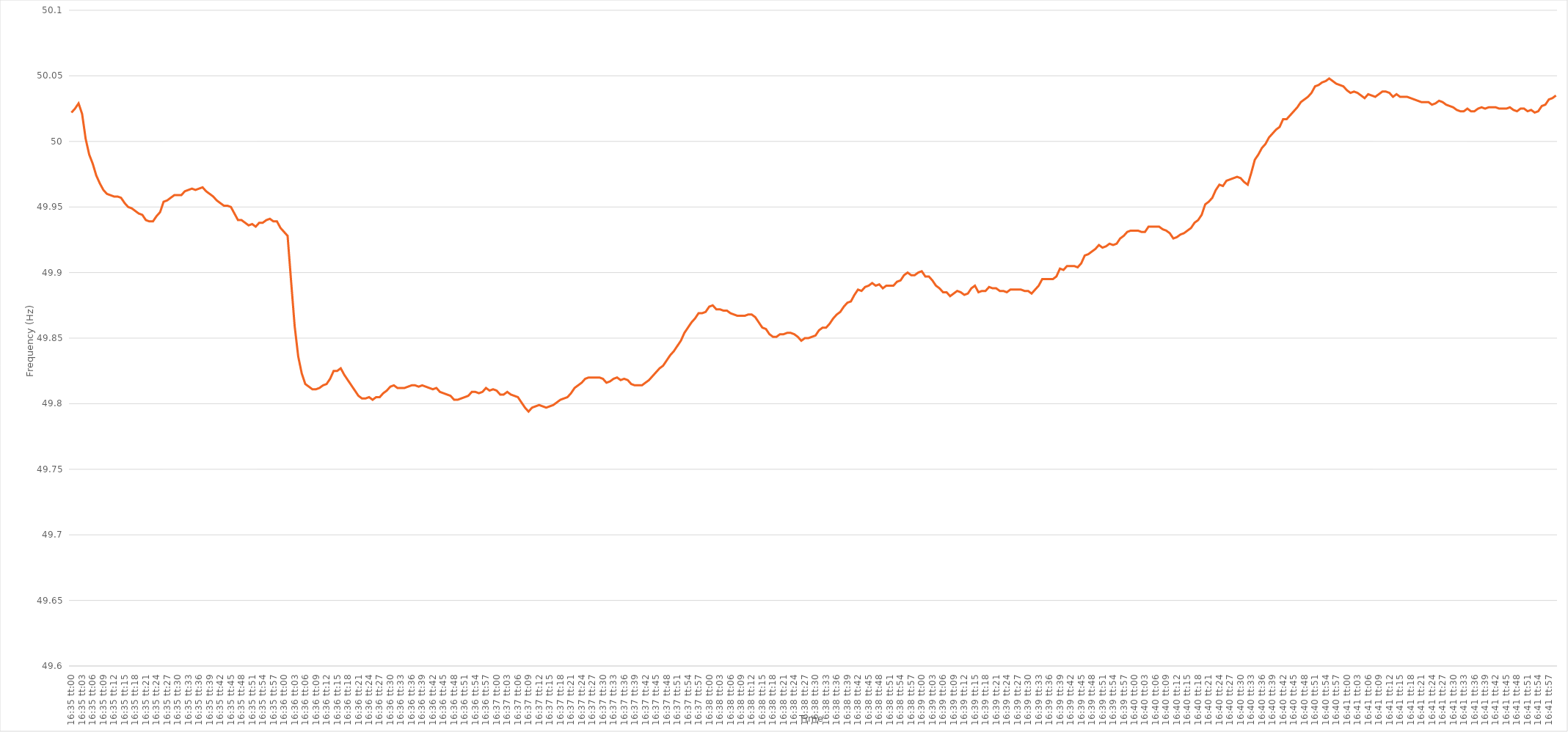
| Category | Series 0 |
|---|---|
| 0.6909722222222222 | 50.022 |
| 0.6909837962962962 | 50.025 |
| 0.6909953703703704 | 50.029 |
| 0.6910069444444445 | 50.021 |
| 0.6910185185185185 | 50.002 |
| 0.6910300925925926 | 49.99 |
| 0.6910416666666667 | 49.983 |
| 0.6910532407407407 | 49.974 |
| 0.6910648148148147 | 49.968 |
| 0.6910763888888889 | 49.963 |
| 0.691087962962963 | 49.96 |
| 0.691099537037037 | 49.959 |
| 0.6911111111111111 | 49.958 |
| 0.6911226851851852 | 49.958 |
| 0.6911342592592593 | 49.957 |
| 0.6911458333333332 | 49.953 |
| 0.6911574074074074 | 49.95 |
| 0.6911689814814815 | 49.949 |
| 0.6911805555555556 | 49.947 |
| 0.6911921296296296 | 49.945 |
| 0.6912037037037037 | 49.944 |
| 0.6912152777777778 | 49.94 |
| 0.691226851851852 | 49.939 |
| 0.6912384259259259 | 49.939 |
| 0.69125 | 49.943 |
| 0.6912615740740741 | 49.946 |
| 0.6912731481481481 | 49.954 |
| 0.6912847222222221 | 49.955 |
| 0.6912962962962963 | 49.957 |
| 0.6913078703703704 | 49.959 |
| 0.6913194444444444 | 49.959 |
| 0.6913310185185185 | 49.959 |
| 0.6913425925925926 | 49.962 |
| 0.6913541666666667 | 49.963 |
| 0.6913657407407406 | 49.964 |
| 0.6913773148148148 | 49.963 |
| 0.6913888888888889 | 49.964 |
| 0.691400462962963 | 49.965 |
| 0.691412037037037 | 49.962 |
| 0.6914236111111111 | 49.96 |
| 0.6914351851851852 | 49.958 |
| 0.6914467592592594 | 49.955 |
| 0.6914583333333333 | 49.953 |
| 0.6914699074074074 | 49.951 |
| 0.6914814814814815 | 49.951 |
| 0.6914930555555556 | 49.95 |
| 0.6915046296296296 | 49.945 |
| 0.6915162037037037 | 49.94 |
| 0.6915277777777779 | 49.94 |
| 0.6915393518518519 | 49.938 |
| 0.6915509259259259 | 49.936 |
| 0.6915625 | 49.937 |
| 0.6915740740740741 | 49.935 |
| 0.691585648148148 | 49.938 |
| 0.6915972222222222 | 49.938 |
| 0.6916087962962963 | 49.94 |
| 0.6916203703703704 | 49.941 |
| 0.6916319444444444 | 49.939 |
| 0.6916435185185185 | 49.939 |
| 0.6916550925925926 | 49.934 |
| 0.6916666666666668 | 49.931 |
| 0.6916782407407407 | 49.928 |
| 0.6916898148148148 | 49.893 |
| 0.6917013888888889 | 49.859 |
| 0.691712962962963 | 49.836 |
| 0.691724537037037 | 49.823 |
| 0.6917361111111111 | 49.815 |
| 0.6917476851851853 | 49.813 |
| 0.6917592592592593 | 49.811 |
| 0.6917708333333333 | 49.811 |
| 0.6917824074074074 | 49.812 |
| 0.6917939814814815 | 49.814 |
| 0.6918055555555555 | 49.815 |
| 0.6918171296296296 | 49.819 |
| 0.6918287037037038 | 49.825 |
| 0.6918402777777778 | 49.825 |
| 0.6918518518518518 | 49.827 |
| 0.6918634259259259 | 49.822 |
| 0.691875 | 49.818 |
| 0.6918865740740742 | 49.814 |
| 0.6918981481481481 | 49.81 |
| 0.6919097222222222 | 49.806 |
| 0.6919212962962963 | 49.804 |
| 0.6919328703703704 | 49.804 |
| 0.6919444444444444 | 49.805 |
| 0.6919560185185185 | 49.803 |
| 0.6919675925925927 | 49.805 |
| 0.6919791666666667 | 49.805 |
| 0.6919907407407407 | 49.808 |
| 0.6920023148148148 | 49.81 |
| 0.6920138888888889 | 49.813 |
| 0.6920254629629629 | 49.814 |
| 0.692037037037037 | 49.812 |
| 0.6920486111111112 | 49.812 |
| 0.6920601851851852 | 49.812 |
| 0.6920717592592592 | 49.813 |
| 0.6920833333333333 | 49.814 |
| 0.6920949074074074 | 49.814 |
| 0.6921064814814816 | 49.813 |
| 0.6921180555555555 | 49.814 |
| 0.6921296296296297 | 49.813 |
| 0.6921412037037037 | 49.812 |
| 0.6921527777777778 | 49.811 |
| 0.6921643518518518 | 49.812 |
| 0.6921759259259259 | 49.809 |
| 0.6921875000000001 | 49.808 |
| 0.6921990740740741 | 49.807 |
| 0.6922106481481481 | 49.806 |
| 0.6922222222222222 | 49.803 |
| 0.6922337962962963 | 49.803 |
| 0.6922453703703703 | 49.804 |
| 0.6922569444444444 | 49.805 |
| 0.6922685185185186 | 49.806 |
| 0.6922800925925926 | 49.809 |
| 0.6922916666666666 | 49.809 |
| 0.6923032407407407 | 49.808 |
| 0.6923148148148148 | 49.809 |
| 0.692326388888889 | 49.812 |
| 0.6923379629629629 | 49.81 |
| 0.692349537037037 | 49.811 |
| 0.6923611111111111 | 49.81 |
| 0.6923726851851852 | 49.807 |
| 0.6923842592592592 | 49.807 |
| 0.6923958333333333 | 49.809 |
| 0.6924074074074075 | 49.807 |
| 0.6924189814814815 | 49.806 |
| 0.6924305555555555 | 49.805 |
| 0.6924421296296296 | 49.801 |
| 0.6924537037037037 | 49.797 |
| 0.6924652777777777 | 49.794 |
| 0.6924768518518518 | 49.797 |
| 0.692488425925926 | 49.798 |
| 0.6925 | 49.799 |
| 0.692511574074074 | 49.798 |
| 0.6925231481481481 | 49.797 |
| 0.6925347222222222 | 49.798 |
| 0.6925462962962964 | 49.799 |
| 0.6925578703703703 | 49.801 |
| 0.6925694444444445 | 49.803 |
| 0.6925810185185185 | 49.804 |
| 0.6925925925925926 | 49.805 |
| 0.6926041666666666 | 49.808 |
| 0.6926157407407407 | 49.812 |
| 0.6926273148148149 | 49.814 |
| 0.6926388888888889 | 49.816 |
| 0.692650462962963 | 49.819 |
| 0.692662037037037 | 49.82 |
| 0.6926736111111111 | 49.82 |
| 0.6926851851851853 | 49.82 |
| 0.6926967592592592 | 49.82 |
| 0.6927083333333334 | 49.819 |
| 0.6927199074074074 | 49.816 |
| 0.6927314814814814 | 49.817 |
| 0.6927430555555555 | 49.819 |
| 0.6927546296296296 | 49.82 |
| 0.6927662037037038 | 49.818 |
| 0.6927777777777777 | 49.819 |
| 0.6927893518518519 | 49.818 |
| 0.6928009259259259 | 49.815 |
| 0.6928125 | 49.814 |
| 0.692824074074074 | 49.814 |
| 0.6928356481481481 | 49.814 |
| 0.6928472222222223 | 49.816 |
| 0.6928587962962963 | 49.818 |
| 0.6928703703703704 | 49.821 |
| 0.6928819444444444 | 49.824 |
| 0.6928935185185185 | 49.827 |
| 0.6929050925925927 | 49.829 |
| 0.6929166666666666 | 49.833 |
| 0.6929282407407408 | 49.837 |
| 0.6929398148148148 | 49.84 |
| 0.692951388888889 | 49.844 |
| 0.6929629629629629 | 49.848 |
| 0.692974537037037 | 49.854 |
| 0.6929861111111112 | 49.858 |
| 0.6929976851851851 | 49.862 |
| 0.6930092592592593 | 49.865 |
| 0.6930208333333333 | 49.869 |
| 0.6930324074074075 | 49.869 |
| 0.6930439814814814 | 49.87 |
| 0.6930555555555555 | 49.874 |
| 0.6930671296296297 | 49.875 |
| 0.6930787037037037 | 49.872 |
| 0.6930902777777778 | 49.872 |
| 0.6931018518518518 | 49.871 |
| 0.693113425925926 | 49.871 |
| 0.6931250000000001 | 49.869 |
| 0.693136574074074 | 49.868 |
| 0.6931481481481482 | 49.867 |
| 0.6931597222222222 | 49.867 |
| 0.6931712962962964 | 49.867 |
| 0.6931828703703703 | 49.868 |
| 0.6931944444444444 | 49.868 |
| 0.6932060185185186 | 49.866 |
| 0.6932175925925925 | 49.862 |
| 0.6932291666666667 | 49.858 |
| 0.6932407407407407 | 49.857 |
| 0.6932523148148149 | 49.853 |
| 0.6932638888888888 | 49.851 |
| 0.6932754629629629 | 49.851 |
| 0.6932870370370371 | 49.853 |
| 0.6932986111111111 | 49.853 |
| 0.6933101851851852 | 49.854 |
| 0.6933217592592592 | 49.854 |
| 0.6933333333333334 | 49.853 |
| 0.6933449074074075 | 49.851 |
| 0.6933564814814814 | 49.848 |
| 0.6933680555555556 | 49.85 |
| 0.6933796296296296 | 49.85 |
| 0.6933912037037038 | 49.851 |
| 0.6934027777777777 | 49.852 |
| 0.6934143518518519 | 49.856 |
| 0.693425925925926 | 49.858 |
| 0.6934374999999999 | 49.858 |
| 0.6934490740740741 | 49.861 |
| 0.6934606481481481 | 49.865 |
| 0.6934722222222223 | 49.868 |
| 0.6934837962962962 | 49.87 |
| 0.6934953703703703 | 49.874 |
| 0.6935069444444445 | 49.877 |
| 0.6935185185185185 | 49.878 |
| 0.6935300925925926 | 49.883 |
| 0.6935416666666666 | 49.887 |
| 0.6935532407407408 | 49.886 |
| 0.6935648148148149 | 49.889 |
| 0.6935763888888888 | 49.89 |
| 0.693587962962963 | 49.892 |
| 0.693599537037037 | 49.89 |
| 0.6936111111111112 | 49.891 |
| 0.6936226851851851 | 49.888 |
| 0.6936342592592593 | 49.89 |
| 0.6936458333333334 | 49.89 |
| 0.6936574074074073 | 49.89 |
| 0.6936689814814815 | 49.893 |
| 0.6936805555555555 | 49.894 |
| 0.6936921296296297 | 49.898 |
| 0.6937037037037036 | 49.9 |
| 0.6937152777777778 | 49.898 |
| 0.6937268518518519 | 49.898 |
| 0.6937384259259259 | 49.9 |
| 0.69375 | 49.901 |
| 0.693761574074074 | 49.897 |
| 0.6937731481481482 | 49.897 |
| 0.6937847222222223 | 49.894 |
| 0.6937962962962962 | 49.89 |
| 0.6938078703703704 | 49.888 |
| 0.6938194444444444 | 49.885 |
| 0.6938310185185186 | 49.885 |
| 0.6938425925925925 | 49.882 |
| 0.6938541666666667 | 49.884 |
| 0.6938657407407408 | 49.886 |
| 0.6938773148148147 | 49.885 |
| 0.6938888888888889 | 49.883 |
| 0.6939004629629629 | 49.884 |
| 0.6939120370370371 | 49.888 |
| 0.693923611111111 | 49.89 |
| 0.6939351851851852 | 49.885 |
| 0.6939467592592593 | 49.886 |
| 0.6939583333333333 | 49.886 |
| 0.6939699074074074 | 49.889 |
| 0.6939814814814814 | 49.888 |
| 0.6939930555555556 | 49.888 |
| 0.6940046296296297 | 49.886 |
| 0.6940162037037036 | 49.886 |
| 0.6940277777777778 | 49.885 |
| 0.6940393518518518 | 49.887 |
| 0.694050925925926 | 49.887 |
| 0.6940624999999999 | 49.887 |
| 0.6940740740740741 | 49.887 |
| 0.6940856481481482 | 49.886 |
| 0.6940972222222223 | 49.886 |
| 0.6941087962962963 | 49.884 |
| 0.6941203703703703 | 49.887 |
| 0.6941319444444445 | 49.89 |
| 0.6941435185185186 | 49.895 |
| 0.6941550925925926 | 49.895 |
| 0.6941666666666667 | 49.895 |
| 0.6941782407407407 | 49.895 |
| 0.6941898148148148 | 49.897 |
| 0.6942013888888888 | 49.903 |
| 0.694212962962963 | 49.902 |
| 0.6942245370370371 | 49.905 |
| 0.694236111111111 | 49.905 |
| 0.6942476851851852 | 49.905 |
| 0.6942592592592592 | 49.904 |
| 0.6942708333333334 | 49.907 |
| 0.6942824074074073 | 49.913 |
| 0.6942939814814815 | 49.914 |
| 0.6943055555555556 | 49.916 |
| 0.6943171296296297 | 49.918 |
| 0.6943287037037037 | 49.921 |
| 0.6943402777777777 | 49.919 |
| 0.6943518518518519 | 49.92 |
| 0.694363425925926 | 49.922 |
| 0.694375 | 49.921 |
| 0.6943865740740741 | 49.922 |
| 0.6943981481481482 | 49.926 |
| 0.6944097222222222 | 49.928 |
| 0.6944212962962962 | 49.931 |
| 0.6944328703703704 | 49.932 |
| 0.6944444444444445 | 49.932 |
| 0.6944560185185185 | 49.932 |
| 0.6944675925925926 | 49.931 |
| 0.6944791666666666 | 49.931 |
| 0.6944907407407408 | 49.935 |
| 0.6945023148148147 | 49.935 |
| 0.6945138888888889 | 49.935 |
| 0.694525462962963 | 49.935 |
| 0.6945370370370371 | 49.933 |
| 0.6945486111111111 | 49.932 |
| 0.6945601851851851 | 49.93 |
| 0.6945717592592593 | 49.926 |
| 0.6945833333333334 | 49.927 |
| 0.6945949074074074 | 49.929 |
| 0.6946064814814815 | 49.93 |
| 0.6946180555555556 | 49.932 |
| 0.6946296296296296 | 49.934 |
| 0.6946412037037036 | 49.938 |
| 0.6946527777777778 | 49.94 |
| 0.6946643518518519 | 49.944 |
| 0.6946759259259259 | 49.952 |
| 0.6946875 | 49.954 |
| 0.694699074074074 | 49.957 |
| 0.6947106481481482 | 49.963 |
| 0.6947222222222221 | 49.967 |
| 0.6947337962962963 | 49.966 |
| 0.6947453703703704 | 49.97 |
| 0.6947569444444445 | 49.971 |
| 0.6947685185185185 | 49.972 |
| 0.6947800925925925 | 49.973 |
| 0.6947916666666667 | 49.972 |
| 0.6948032407407408 | 49.969 |
| 0.6948148148148148 | 49.967 |
| 0.6948263888888889 | 49.976 |
| 0.694837962962963 | 49.986 |
| 0.694849537037037 | 49.99 |
| 0.694861111111111 | 49.995 |
| 0.6948726851851852 | 49.998 |
| 0.6948842592592593 | 50.003 |
| 0.6948958333333333 | 50.006 |
| 0.6949074074074074 | 50.009 |
| 0.6949189814814815 | 50.011 |
| 0.6949305555555556 | 50.017 |
| 0.6949421296296295 | 50.017 |
| 0.6949537037037037 | 50.02 |
| 0.6949652777777778 | 50.023 |
| 0.6949768518518519 | 50.026 |
| 0.6949884259259259 | 50.03 |
| 0.695 | 50.032 |
| 0.6950115740740741 | 50.034 |
| 0.6950231481481483 | 50.037 |
| 0.6950347222222222 | 50.042 |
| 0.6950462962962963 | 50.043 |
| 0.6950578703703704 | 50.045 |
| 0.6950694444444444 | 50.046 |
| 0.6950810185185184 | 50.048 |
| 0.6950925925925926 | 50.046 |
| 0.6951041666666667 | 50.044 |
| 0.6951157407407407 | 50.043 |
| 0.6951273148148148 | 50.042 |
| 0.6951388888888889 | 50.039 |
| 0.695150462962963 | 50.037 |
| 0.6951620370370369 | 50.038 |
| 0.6951736111111111 | 50.037 |
| 0.6951851851851852 | 50.035 |
| 0.6951967592592593 | 50.033 |
| 0.6952083333333333 | 50.036 |
| 0.6952199074074074 | 50.035 |
| 0.6952314814814815 | 50.034 |
| 0.6952430555555557 | 50.036 |
| 0.6952546296296296 | 50.038 |
| 0.6952662037037037 | 50.038 |
| 0.6952777777777778 | 50.037 |
| 0.6952893518518519 | 50.034 |
| 0.6953009259259259 | 50.036 |
| 0.6953125 | 50.034 |
| 0.6953240740740741 | 50.034 |
| 0.6953356481481481 | 50.034 |
| 0.6953472222222222 | 50.033 |
| 0.6953587962962963 | 50.032 |
| 0.6953703703703704 | 50.031 |
| 0.6953819444444443 | 50.03 |
| 0.6953935185185185 | 50.03 |
| 0.6954050925925926 | 50.03 |
| 0.6954166666666667 | 50.028 |
| 0.6954282407407407 | 50.029 |
| 0.6954398148148148 | 50.031 |
| 0.6954513888888889 | 50.03 |
| 0.6954629629629631 | 50.028 |
| 0.695474537037037 | 50.027 |
| 0.6954861111111111 | 50.026 |
| 0.6954976851851852 | 50.024 |
| 0.6955092592592593 | 50.023 |
| 0.6955208333333333 | 50.023 |
| 0.6955324074074074 | 50.025 |
| 0.6955439814814816 | 50.023 |
| 0.6955555555555556 | 50.023 |
| 0.6955671296296296 | 50.025 |
| 0.6955787037037037 | 50.026 |
| 0.6955902777777778 | 50.025 |
| 0.6956018518518517 | 50.026 |
| 0.6956134259259259 | 50.026 |
| 0.695625 | 50.026 |
| 0.6956365740740741 | 50.025 |
| 0.6956481481481481 | 50.025 |
| 0.6956597222222222 | 50.025 |
| 0.6956712962962963 | 50.026 |
| 0.6956828703703705 | 50.024 |
| 0.6956944444444444 | 50.023 |
| 0.6957060185185185 | 50.025 |
| 0.6957175925925926 | 50.025 |
| 0.6957291666666667 | 50.023 |
| 0.6957407407407407 | 50.024 |
| 0.6957523148148148 | 50.022 |
| 0.695763888888889 | 50.023 |
| 0.695775462962963 | 50.027 |
| 0.695787037037037 | 50.028 |
| 0.6957986111111111 | 50.032 |
| 0.6958101851851852 | 50.033 |
| 0.6958217592592592 | 50.035 |